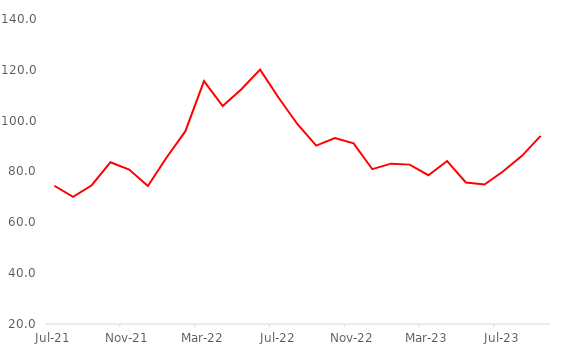
| Category | Series 0 |
|---|---|
| 2021-07-01 | 74.39 |
| 2021-08-01 | 70.02 |
| 2021-09-01 | 74.6 |
| 2021-10-01 | 83.65 |
| 2021-11-01 | 80.77 |
| 2021-12-01 | 74.31 |
| 2022-01-01 | 85.53 |
| 2022-02-01 | 95.76 |
| 2022-03-01 | 115.59 |
| 2022-04-01 | 105.78 |
| 2022-05-01 | 112.37 |
| 2022-06-01 | 120.08 |
| 2022-07-01 | 108.92 |
| 2022-08-01 | 98.6 |
| 2022-09-01 | 90.16 |
| 2022-10-01 | 93.13 |
| 2022-11-01 | 91.07 |
| 2022-12-01 | 80.9 |
| 2023-01-01 | 83.09 |
| 2023-02-01 | 82.71 |
| 2023-03-01 | 78.53 |
| 2023-04-01 | 84.11 |
| 2023-05-01 | 75.7 |
| 2023-06-01 | 74.89 |
| 2023-07-01 | 80.1 |
| 2023-08-01 | 86.163 |
| 2023-09-01 | 94 |